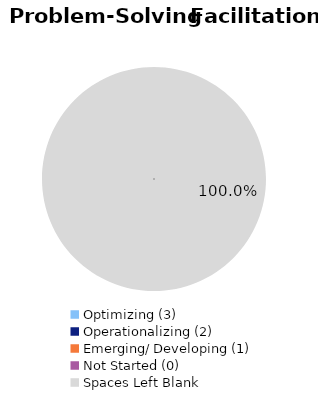
| Category | Series 0 |
|---|---|
| Optimizing (3) | 0 |
| Operationalizing (2) | 0 |
| Emerging/ Developing (1) | 0 |
| Not Started (0) | 0 |
| Spaces Left Blank | 1 |